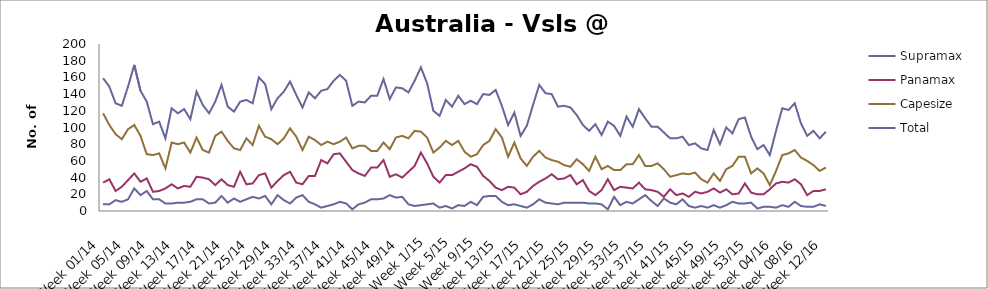
| Category | Supramax | Panamax | Capesize | Total |
|---|---|---|---|---|
| Week 01/14 | 8 | 34 | 117 | 159 |
| Week 02/14 | 8 | 38 | 103 | 149 |
| Week 03/14 | 13 | 24 | 92 | 129 |
| Week 04/14 | 11 | 29 | 86 | 126 |
| Week 05/14 | 14 | 37 | 98 | 149 |
| Week 06/14 | 27 | 45 | 103 | 175 |
| Week 07/14 | 19 | 35 | 90 | 144 |
| Week 08/14 | 24 | 39 | 68 | 131 |
| Week 09/14 | 14 | 23 | 67 | 104 |
| Week 10/14 | 14 | 24 | 69 | 107 |
| Week 11/14 | 9 | 27 | 51 | 87 |
| Week 12/14 | 9 | 32 | 82 | 123 |
| Week 13/14 | 10 | 27 | 80 | 117 |
| Week 14/14 | 10 | 30 | 82 | 122 |
| Week 15/14 | 11 | 29 | 70 | 110 |
| Week 16/14 | 14 | 41 | 88 | 143 |
| Week 17/14 | 14 | 40 | 73 | 127 |
| Week 18/14 | 9 | 38 | 70 | 117 |
| Week 19/14 | 10 | 31 | 90 | 131 |
| Week 20/14 | 18 | 38 | 95 | 151 |
| Week 21/14 | 10 | 31 | 84 | 125 |
| Week 22/14 | 15 | 29 | 75 | 119 |
| Week 23/14 | 11 | 47 | 73 | 131 |
| Week 24/14 | 14 | 32 | 87 | 133 |
| Week 25/14 | 17 | 33 | 79 | 129 |
| Week 26/14 | 15 | 43 | 102 | 160 |
| Week 27/14 | 18 | 45 | 89 | 152 |
| Week 28/14 | 8 | 28 | 86 | 122 |
| Week 29/14 | 19 | 36 | 80 | 135 |
| Week 30/14 | 13 | 43 | 87 | 143 |
| Week 31/14 | 9 | 47 | 99 | 155 |
| Week 32/14 | 16 | 34 | 89 | 139 |
| Week 33/14 | 19 | 32 | 73 | 124 |
| Week 34/14 | 11 | 42 | 89 | 142 |
| Week 35/14 | 8 | 42 | 85 | 135 |
| Week 36/14 | 4 | 61 | 79 | 144 |
| Week 37/14 | 6 | 57 | 83 | 146 |
| Week 38/14 | 8 | 68 | 80 | 156 |
| Week 39/14 | 11 | 69 | 83 | 163 |
| Week 40/14 | 9 | 59 | 88 | 156 |
| Week 41/14 | 2 | 49 | 75 | 126 |
| Week 42/14 | 8 | 45 | 78 | 131 |
| Week 43/14 | 10 | 42 | 78 | 130 |
| Week 44/14 | 14 | 52 | 72 | 138 |
| Week 45/14 | 14 | 52 | 72 | 138 |
| Week 46/14 | 15 | 61 | 82 | 158 |
| Week 47/14 | 19 | 41 | 74 | 134 |
| Week 48/14 | 16 | 44 | 88 | 148 |
| Week 49/14 | 17 | 40 | 90 | 147 |
| Week 50/14 | 8 | 47 | 87 | 142 |
| Week 51/14 | 6 | 54 | 96 | 156 |
| Week 52/14 | 7 | 70 | 95 | 172 |
| Week 1/15 | 8 | 57 | 88 | 153 |
| Week 2/15 | 9 | 41 | 70 | 120 |
| Week 3/15 | 4 | 34 | 76 | 114 |
| Week 4/15 | 6 | 43 | 84 | 133 |
| Week 5/15 | 3 | 43 | 79 | 125 |
| Week 6/15 | 7 | 47 | 84 | 138 |
| Week 7/15 | 6 | 51 | 71 | 128 |
| Week 8/15 | 11 | 56 | 65 | 132 |
| Week 9/15 | 7 | 53 | 68 | 128 |
| Week 10/15 | 17 | 42 | 79 | 140 |
| Week 11/15 | 18 | 36 | 84 | 139 |
| Week 12/15 | 18 | 28 | 98 | 145 |
| Week 13/15 | 11 | 25 | 88 | 126 |
| Week 14/15 | 7 | 29 | 65 | 103 |
| Week 15/15 | 8 | 28 | 82 | 118 |
| Week 16/15 | 6 | 20 | 63 | 90 |
| Week 17/15 | 4 | 23 | 54 | 102 |
| Week 18/15 | 8 | 30 | 65 | 127 |
| Week 19/15 | 14 | 35 | 72 | 151 |
| Week 20/15 | 10 | 39 | 64 | 141 |
| Week 21/15 | 9 | 44 | 61 | 140 |
| Week 22/15 | 8 | 38 | 59 | 125 |
| Week 23/15 | 10 | 39 | 55 | 126 |
| Week 24/15 | 10 | 43 | 53 | 124 |
| Week 25/15 | 10 | 32 | 62 | 115 |
| Week 26/15 | 10 | 37 | 56 | 103 |
| Week 27/15 | 9 | 24 | 48 | 96 |
| Week 28/15 | 9 | 19 | 65 | 104 |
| Week 29/15 | 8 | 25 | 50 | 91 |
| Week 30/15 | 2 | 38 | 54 | 107 |
| Week 31/15 | 17 | 25 | 49 | 102 |
| Week 32/15 | 7 | 29 | 49 | 90 |
| Week 33/15 | 11 | 28 | 56 | 113 |
| Week 34/15 | 9 | 27 | 56 | 101 |
| Week 35/15 | 14 | 34 | 67 | 122 |
| Week 36/15 | 19 | 26 | 54 | 111 |
| Week 37/15 | 12 | 25 | 54 | 101 |
| Week 38/15 | 6 | 23 | 57 | 101 |
| Week 39/15 | 15 | 17 | 50 | 94 |
| Week 40/15 | 10 | 26 | 41 | 87 |
| Week 41/15 | 8 | 19 | 43 | 87 |
| Week 42/15 | 14 | 21 | 45 | 89 |
| Week 43/15 | 6 | 17 | 44 | 79 |
| Week 44/15 | 4 | 23 | 46 | 81 |
| Week 45/15 | 6 | 21 | 38 | 75 |
| Week 46/15 | 4 | 23 | 34 | 73 |
| Week 47/15 | 7 | 27 | 45 | 97 |
| Week 48/15 | 4 | 22 | 36 | 80 |
| Week 49/15 | 7 | 26 | 50 | 100 |
| Week 50/15 | 11 | 20 | 54 | 93 |
| Week 51/15 | 9 | 21 | 65 | 110 |
| Week 52/15 | 9 | 33 | 65 | 112 |
| Week 53/15 | 10 | 22 | 45 | 89 |
| Week 01/16 | 3 | 20 | 51 | 74 |
| Week 02/16 | 5 | 20 | 45 | 79 |
| Week 03/16 | 5 | 26 | 31 | 67 |
| Week 04/16 | 4 | 33 | 48 | 96 |
| Week 05/16 | 7 | 35 | 67 | 123 |
| Week 06/16 | 5 | 34 | 69 | 121 |
| Week 07/16 | 11 | 38 | 73 | 129 |
| Week 08/16 | 6 | 32 | 64 | 105 |
| Week 09/16 | 5 | 19 | 60 | 90 |
| Week 10/16 | 5 | 24 | 55 | 96 |
| Week 11/16 | 8 | 24 | 48 | 87 |
| Week 12/16 | 6 | 26 | 52 | 95 |